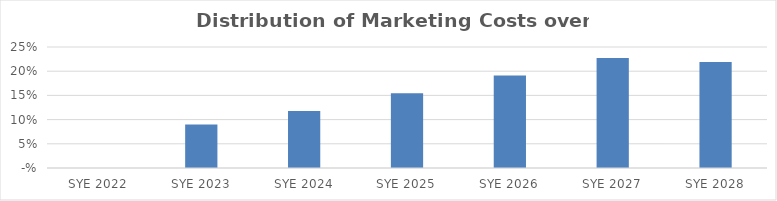
| Category | Series 0 |
|---|---|
| 2022.0 | 0 |
| 2023.0 | 0.09 |
| 2024.0 | 0.118 |
| 2025.0 | 0.154 |
| 2026.0 | 0.191 |
| 2027.0 | 0.228 |
| 2028.0 | 0.219 |